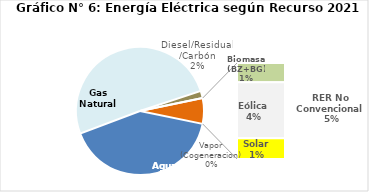
| Category | Series 0 |
|---|---|
| Agua | 1980.994 |
| Gas Natural | 2448.834 |
| Diesel/Residual/Carbón | 88.955 |
| Vapor (Cogeneracion) | 0.205 |
| Biomasa (BZ+BG) | 62.584 |
| Eólica | 182.679 |
| Solar | 67.586 |